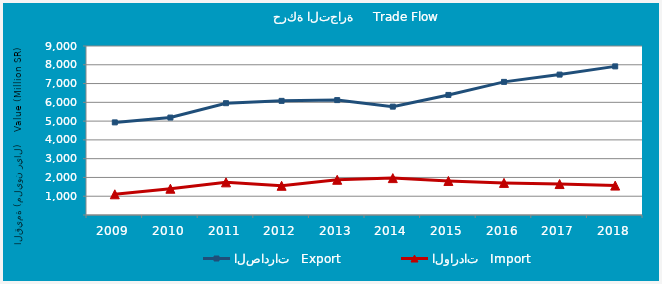
| Category | الصادرات   Export | الواردات   Import |
|---|---|---|
| 2009.0 | 4931888676 | 1103323332 |
| 2010.0 | 5188715069 | 1399500142 |
| 2011.0 | 5954265686 | 1738299917 |
| 2012.0 | 6078043932 | 1555730077 |
| 2013.0 | 6118768859 | 1876194268 |
| 2014.0 | 5770260738 | 1964517405 |
| 2015.0 | 6393984578 | 1813283591 |
| 2016.0 | 7089084043 | 1710261712 |
| 2017.0 | 7476728984 | 1648376615 |
| 2018.0 | 7914869333 | 1566591388 |